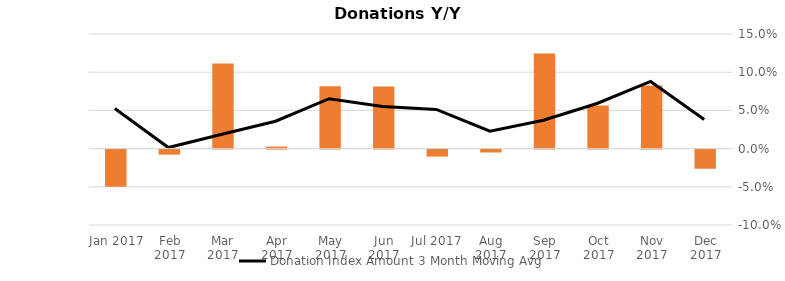
| Category | Donation Index Amount Y/Y Growth |
|---|---|
| Dec 2017 | -0.025 |
| Nov 2017 | 0.083 |
| Oct 2017 | 0.057 |
| Sep 2017 | 0.125 |
| Aug 2017 | -0.004 |
| Jul 2017 | -0.009 |
| Jun 2017 | 0.081 |
| May 2017 | 0.082 |
| Apr 2017 | 0.003 |
| Mar 2017 | 0.112 |
| Feb 2017 | -0.007 |
| Jan 2017 | -0.049 |